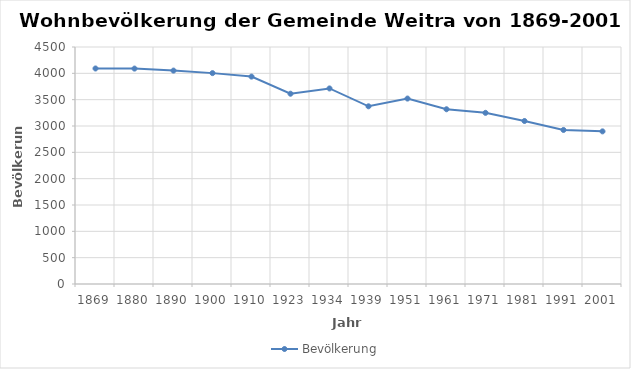
| Category | Bevölkerung |
|---|---|
| 1869.0 | 4092 |
| 1880.0 | 4090 |
| 1890.0 | 4052 |
| 1900.0 | 4004 |
| 1910.0 | 3938 |
| 1923.0 | 3613 |
| 1934.0 | 3713 |
| 1939.0 | 3374 |
| 1951.0 | 3521 |
| 1961.0 | 3318 |
| 1971.0 | 3250 |
| 1981.0 | 3095 |
| 1991.0 | 2925 |
| 2001.0 | 2898 |